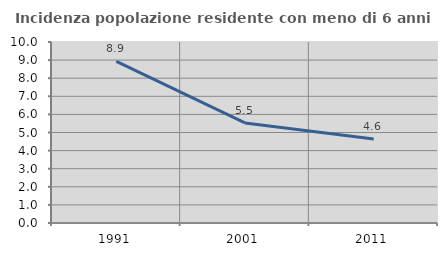
| Category | Incidenza popolazione residente con meno di 6 anni |
|---|---|
| 1991.0 | 8.933 |
| 2001.0 | 5.527 |
| 2011.0 | 4.64 |